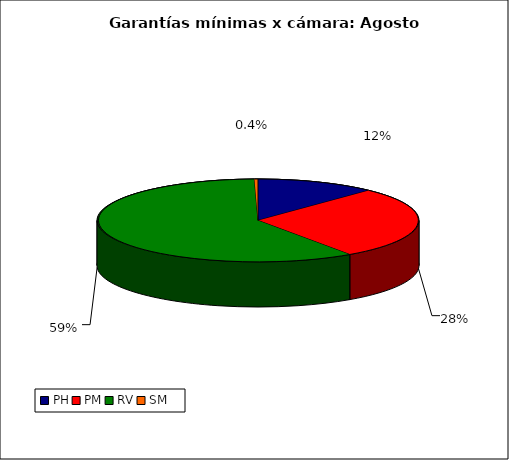
| Category | Series 0 |
|---|---|
| PH | 1843.443 |
| PM | 4313.91 |
| RV | 9048.433 |
| SM | 54.111 |